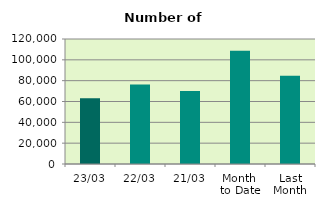
| Category | Series 0 |
|---|---|
| 23/03 | 63024 |
| 22/03 | 76298 |
| 21/03 | 70100 |
| Month 
to Date | 108744.353 |
| Last
Month | 84726.4 |